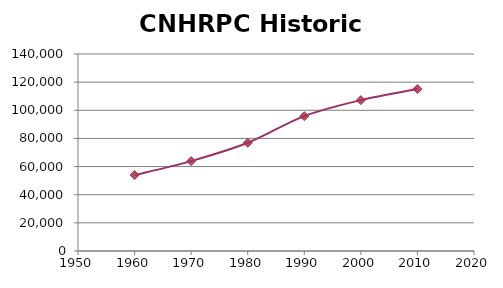
| Category | Series 0 |
|---|---|
| 1960.0 | 53944 |
| 1970.0 | 63891 |
| 1980.0 | 76901 |
| 1990.0 | 95836 |
| 2000.0 | 107220 |
| 2010.0 | 115160 |